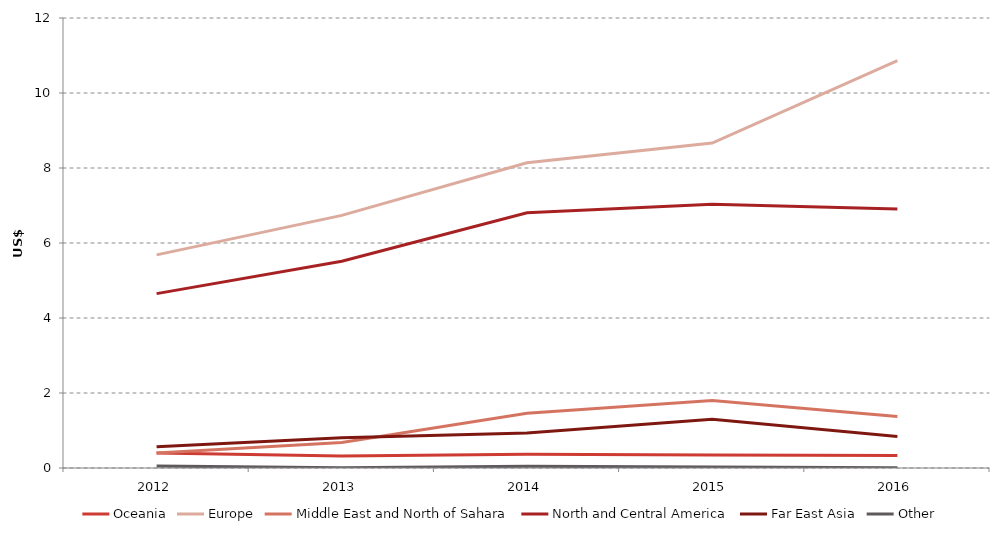
| Category | Oceania | Europe | Middle East and North of Sahara | North and Central America | Far East Asia | Other |
|---|---|---|---|---|---|---|
| 2012.0 | 0.401 | 5.683 | 0.403 | 4.649 | 0.567 | 0.05 |
| 2013.0 | 0.319 | 6.736 | 0.68 | 5.512 | 0.809 | 0.006 |
| 2014.0 | 0.366 | 8.138 | 1.457 | 6.807 | 0.934 | 0.044 |
| 2015.0 | 0.347 | 8.664 | 1.801 | 7.032 | 1.303 | 0.028 |
| 2016.0 | 0.336 | 10.866 | 1.374 | 6.91 | 0.843 | 0.007 |